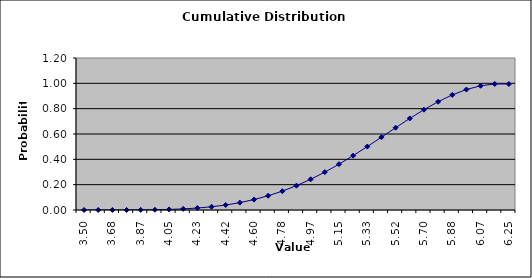
| Category | DISTRIBUTION SCHEDULE |
|---|---|
| 3.5 | 0 |
| 3.591666666666667 | 0 |
| 3.6833333333333336 | 0 |
| 3.7750000000000004 | 0 |
| 3.866666666666667 | 0.001 |
| 3.958333333333334 | 0.002 |
| 4.050000000000001 | 0.004 |
| 4.1416666666666675 | 0.009 |
| 4.233333333333334 | 0.015 |
| 4.325000000000001 | 0.025 |
| 4.416666666666668 | 0.039 |
| 4.508333333333335 | 0.058 |
| 4.600000000000001 | 0.082 |
| 4.691666666666668 | 0.112 |
| 4.783333333333335 | 0.149 |
| 4.875000000000002 | 0.192 |
| 4.966666666666669 | 0.242 |
| 5.058333333333335 | 0.299 |
| 5.150000000000002 | 0.362 |
| 5.241666666666669 | 0.429 |
| 5.333333333333336 | 0.501 |
| 5.4250000000000025 | 0.575 |
| 5.516666666666669 | 0.65 |
| 5.608333333333336 | 0.723 |
| 5.700000000000003 | 0.792 |
| 5.79166666666667 | 0.855 |
| 5.883333333333336 | 0.909 |
| 5.975000000000003 | 0.951 |
| 6.06666666666667 | 0.981 |
| 6.145238095238098 | 0.995 |
| 6.25 | 0.995 |